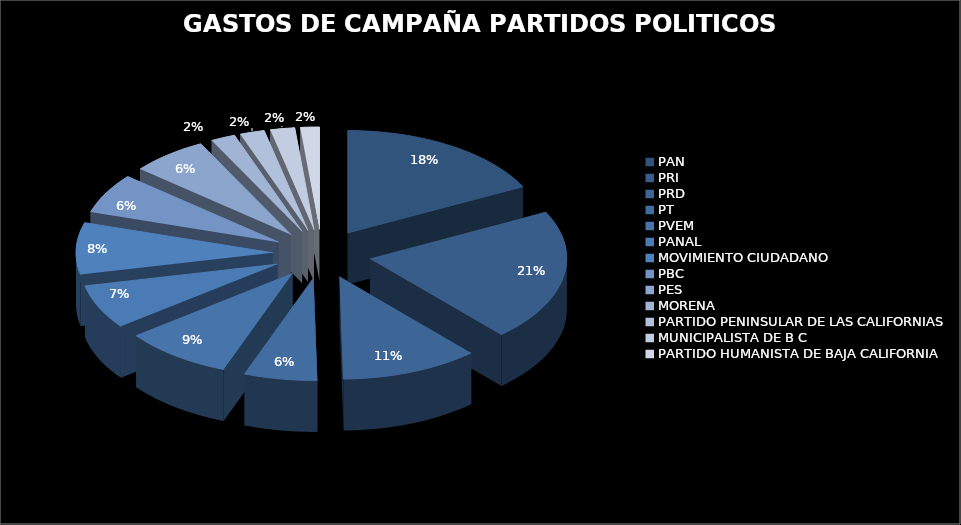
| Category | Series 0 |
|---|---|
| PAN | 6212912.74 |
| PRI | 7386587.29 |
| PRD | 4018438.42 |
| PT | 2127958.26 |
| PVEM | 3161850.55 |
| PANAL | 2472588.99 |
| MOVIMIENTO CIUDADANO | 2893544.01 |
| PBC | 2242835.18 |
| PES | 2242835.18 |
| MORENA | 713521.27 |
| PARTIDO PENINSULAR DE LAS CALIFORNIAS | 713521.27 |
| MUNICIPALISTA DE B C | 713521.27 |
| PARTIDO HUMANISTA DE BAJA CALIFORNIA | 552381.47 |